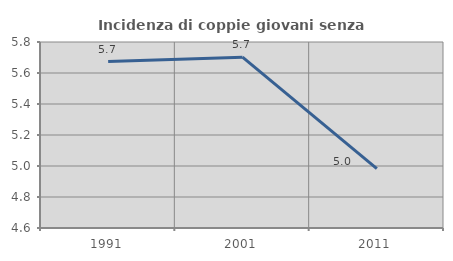
| Category | Incidenza di coppie giovani senza figli |
|---|---|
| 1991.0 | 5.674 |
| 2001.0 | 5.702 |
| 2011.0 | 4.983 |